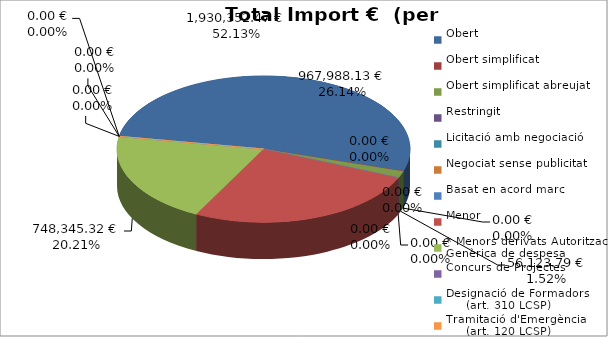
| Category | Total preu
(amb IVA) |
|---|---|
| Obert | 1930352.47 |
| Obert simplificat | 0 |
| Obert simplificat abreujat | 56123.79 |
| Restringit | 0 |
| Licitació amb negociació | 0 |
| Negociat sense publicitat | 0 |
| Basat en acord marc | 0 |
| Menor | 967988.13 |
| * Menors derivats Autorització Genèrica de despesa | 748345.32 |
| Concurs de Projectes | 0 |
| Designació de Formadors
     (art. 310 LCSP) | 0 |
| Tramitació d'Emergència
     (art. 120 LCSP) | 0 |